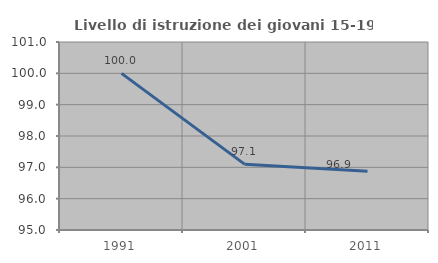
| Category | Livello di istruzione dei giovani 15-19 anni |
|---|---|
| 1991.0 | 100 |
| 2001.0 | 97.101 |
| 2011.0 | 96.875 |